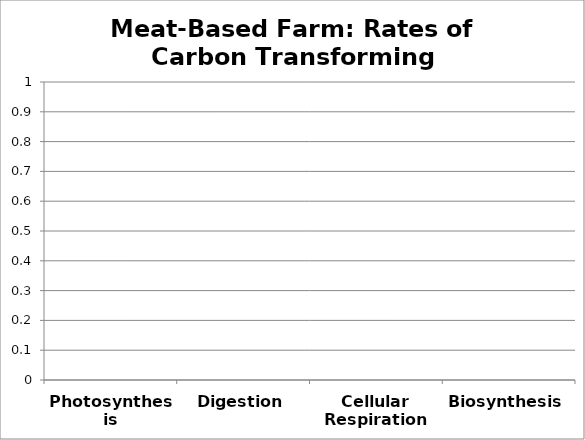
| Category | Series 0 |
|---|---|
| Photosynthesis | 0 |
| Digestion | 0 |
| Cellular Respiration | 0 |
| Biosynthesis | 0 |